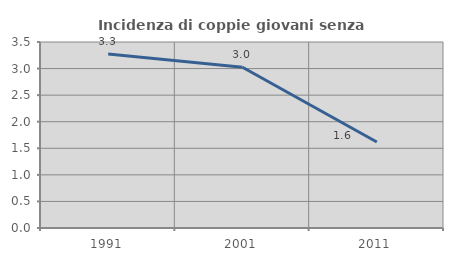
| Category | Incidenza di coppie giovani senza figli |
|---|---|
| 1991.0 | 3.275 |
| 2001.0 | 3.026 |
| 2011.0 | 1.618 |